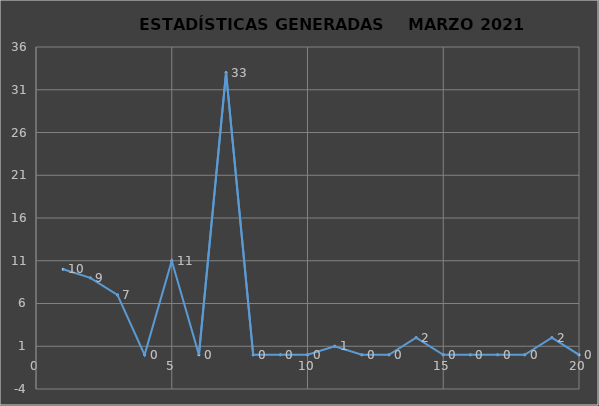
| Category |                   ESTADÍSTICAS GENERADAS     PERÍODO MARZO 2021 CANTIDAD |
|---|---|
| 0 | 10 |
| 1 | 9 |
| 2 | 7 |
| 3 | 0 |
| 4 | 11 |
| 5 | 0 |
| 6 | 33 |
| 7 | 0 |
| 8 | 0 |
| 9 | 0 |
| 10 | 1 |
| 11 | 0 |
| 12 | 0 |
| 13 | 2 |
| 14 | 0 |
| 15 | 0 |
| 16 | 0 |
| 17 | 0 |
| 18 | 2 |
| 19 | 0 |